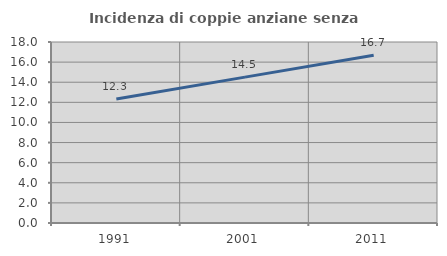
| Category | Incidenza di coppie anziane senza figli  |
|---|---|
| 1991.0 | 12.332 |
| 2001.0 | 14.507 |
| 2011.0 | 16.686 |